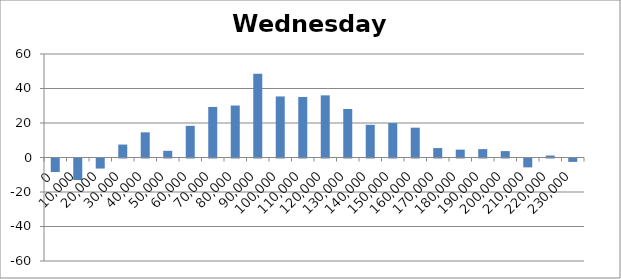
| Category | Wednesday 60 |
|---|---|
| 0.0 | -7.82 |
| 10000.0 | -12.49 |
| 20000.0 | -5.825 |
| 30000.0 | 7.505 |
| 40000.0 | 14.585 |
| 50000.0 | 3.88 |
| 60000.0 | 18.345 |
| 70000.0 | 29.31 |
| 80000.0 | 30.135 |
| 90000.0 | 48.535 |
| 100000.0 | 35.39 |
| 110000.0 | 35.095 |
| 120000.0 | 36.03 |
| 130000.0 | 28.13 |
| 140000.0 | 18.95 |
| 150000.0 | 19.96 |
| 160000.0 | 17.285 |
| 170000.0 | 5.475 |
| 180000.0 | 4.555 |
| 190000.0 | 4.875 |
| 200000.0 | 3.71 |
| 210000.0 | -5.14 |
| 220000.0 | 1.146 |
| 230000.0 | -1.965 |